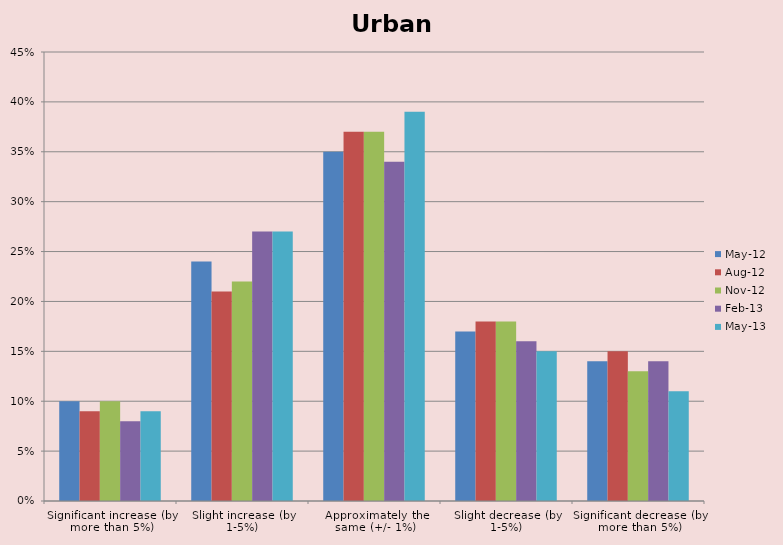
| Category | May-12 | Aug-12 | Nov-12 | Feb-13 | May-13 |
|---|---|---|---|---|---|
| Significant increase (by more than 5%) | 0.1 | 0.09 | 0.1 | 0.08 | 0.09 |
| Slight increase (by 1-5%) | 0.24 | 0.21 | 0.22 | 0.27 | 0.27 |
| Approximately the same (+/- 1%) | 0.35 | 0.37 | 0.37 | 0.34 | 0.39 |
| Slight decrease (by 1-5%) | 0.17 | 0.18 | 0.18 | 0.16 | 0.15 |
| Significant decrease (by more than 5%) | 0.14 | 0.15 | 0.13 | 0.14 | 0.11 |